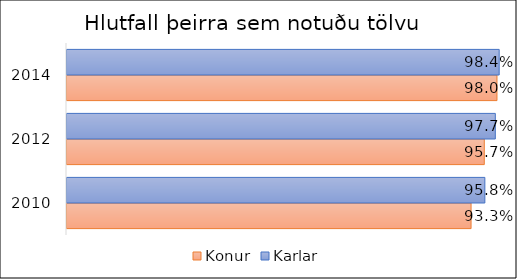
| Category | Konur | Karlar |
|---|---|---|
| 2010.0 | 0.933 | 0.958 |
| 2012.0 | 0.957 | 0.977 |
| 2014.0 | 0.98 | 0.984 |